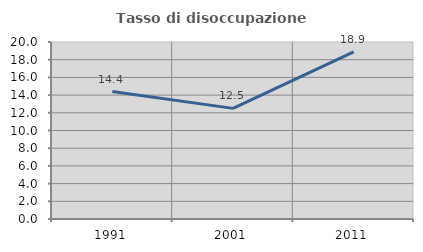
| Category | Tasso di disoccupazione giovanile  |
|---|---|
| 1991.0 | 14.407 |
| 2001.0 | 12.5 |
| 2011.0 | 18.872 |